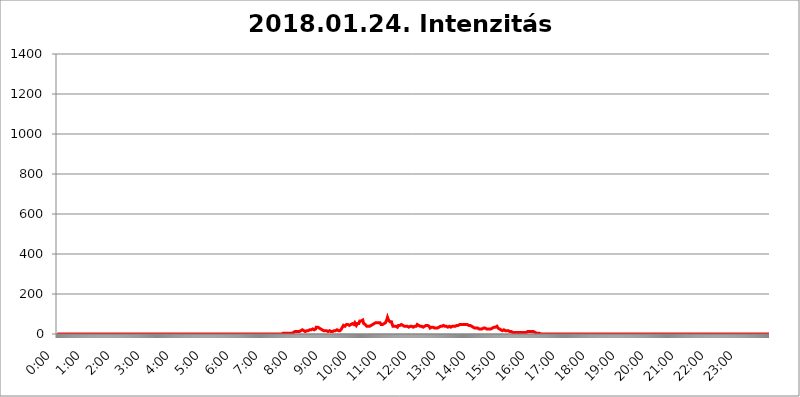
| Category | 2018.01.24. Intenzitás [W/m^2] |
|---|---|
| 0.0 | 0 |
| 0.0006944444444444445 | 0 |
| 0.001388888888888889 | 0 |
| 0.0020833333333333333 | 0 |
| 0.002777777777777778 | 0 |
| 0.003472222222222222 | 0 |
| 0.004166666666666667 | 0 |
| 0.004861111111111111 | 0 |
| 0.005555555555555556 | 0 |
| 0.0062499999999999995 | 0 |
| 0.006944444444444444 | 0 |
| 0.007638888888888889 | 0 |
| 0.008333333333333333 | 0 |
| 0.009027777777777779 | 0 |
| 0.009722222222222222 | 0 |
| 0.010416666666666666 | 0 |
| 0.011111111111111112 | 0 |
| 0.011805555555555555 | 0 |
| 0.012499999999999999 | 0 |
| 0.013194444444444444 | 0 |
| 0.013888888888888888 | 0 |
| 0.014583333333333332 | 0 |
| 0.015277777777777777 | 0 |
| 0.015972222222222224 | 0 |
| 0.016666666666666666 | 0 |
| 0.017361111111111112 | 0 |
| 0.018055555555555557 | 0 |
| 0.01875 | 0 |
| 0.019444444444444445 | 0 |
| 0.02013888888888889 | 0 |
| 0.020833333333333332 | 0 |
| 0.02152777777777778 | 0 |
| 0.022222222222222223 | 0 |
| 0.02291666666666667 | 0 |
| 0.02361111111111111 | 0 |
| 0.024305555555555556 | 0 |
| 0.024999999999999998 | 0 |
| 0.025694444444444447 | 0 |
| 0.02638888888888889 | 0 |
| 0.027083333333333334 | 0 |
| 0.027777777777777776 | 0 |
| 0.02847222222222222 | 0 |
| 0.029166666666666664 | 0 |
| 0.029861111111111113 | 0 |
| 0.030555555555555555 | 0 |
| 0.03125 | 0 |
| 0.03194444444444445 | 0 |
| 0.03263888888888889 | 0 |
| 0.03333333333333333 | 0 |
| 0.034027777777777775 | 0 |
| 0.034722222222222224 | 0 |
| 0.035416666666666666 | 0 |
| 0.036111111111111115 | 0 |
| 0.03680555555555556 | 0 |
| 0.0375 | 0 |
| 0.03819444444444444 | 0 |
| 0.03888888888888889 | 0 |
| 0.03958333333333333 | 0 |
| 0.04027777777777778 | 0 |
| 0.04097222222222222 | 0 |
| 0.041666666666666664 | 0 |
| 0.042361111111111106 | 0 |
| 0.04305555555555556 | 0 |
| 0.043750000000000004 | 0 |
| 0.044444444444444446 | 0 |
| 0.04513888888888889 | 0 |
| 0.04583333333333334 | 0 |
| 0.04652777777777778 | 0 |
| 0.04722222222222222 | 0 |
| 0.04791666666666666 | 0 |
| 0.04861111111111111 | 0 |
| 0.049305555555555554 | 0 |
| 0.049999999999999996 | 0 |
| 0.05069444444444445 | 0 |
| 0.051388888888888894 | 0 |
| 0.052083333333333336 | 0 |
| 0.05277777777777778 | 0 |
| 0.05347222222222222 | 0 |
| 0.05416666666666667 | 0 |
| 0.05486111111111111 | 0 |
| 0.05555555555555555 | 0 |
| 0.05625 | 0 |
| 0.05694444444444444 | 0 |
| 0.057638888888888885 | 0 |
| 0.05833333333333333 | 0 |
| 0.05902777777777778 | 0 |
| 0.059722222222222225 | 0 |
| 0.06041666666666667 | 0 |
| 0.061111111111111116 | 0 |
| 0.06180555555555556 | 0 |
| 0.0625 | 0 |
| 0.06319444444444444 | 0 |
| 0.06388888888888888 | 0 |
| 0.06458333333333334 | 0 |
| 0.06527777777777778 | 0 |
| 0.06597222222222222 | 0 |
| 0.06666666666666667 | 0 |
| 0.06736111111111111 | 0 |
| 0.06805555555555555 | 0 |
| 0.06874999999999999 | 0 |
| 0.06944444444444443 | 0 |
| 0.07013888888888889 | 0 |
| 0.07083333333333333 | 0 |
| 0.07152777777777779 | 0 |
| 0.07222222222222223 | 0 |
| 0.07291666666666667 | 0 |
| 0.07361111111111111 | 0 |
| 0.07430555555555556 | 0 |
| 0.075 | 0 |
| 0.07569444444444444 | 0 |
| 0.0763888888888889 | 0 |
| 0.07708333333333334 | 0 |
| 0.07777777777777778 | 0 |
| 0.07847222222222222 | 0 |
| 0.07916666666666666 | 0 |
| 0.0798611111111111 | 0 |
| 0.08055555555555556 | 0 |
| 0.08125 | 0 |
| 0.08194444444444444 | 0 |
| 0.08263888888888889 | 0 |
| 0.08333333333333333 | 0 |
| 0.08402777777777777 | 0 |
| 0.08472222222222221 | 0 |
| 0.08541666666666665 | 0 |
| 0.08611111111111112 | 0 |
| 0.08680555555555557 | 0 |
| 0.08750000000000001 | 0 |
| 0.08819444444444445 | 0 |
| 0.08888888888888889 | 0 |
| 0.08958333333333333 | 0 |
| 0.09027777777777778 | 0 |
| 0.09097222222222222 | 0 |
| 0.09166666666666667 | 0 |
| 0.09236111111111112 | 0 |
| 0.09305555555555556 | 0 |
| 0.09375 | 0 |
| 0.09444444444444444 | 0 |
| 0.09513888888888888 | 0 |
| 0.09583333333333333 | 0 |
| 0.09652777777777777 | 0 |
| 0.09722222222222222 | 0 |
| 0.09791666666666667 | 0 |
| 0.09861111111111111 | 0 |
| 0.09930555555555555 | 0 |
| 0.09999999999999999 | 0 |
| 0.10069444444444443 | 0 |
| 0.1013888888888889 | 0 |
| 0.10208333333333335 | 0 |
| 0.10277777777777779 | 0 |
| 0.10347222222222223 | 0 |
| 0.10416666666666667 | 0 |
| 0.10486111111111111 | 0 |
| 0.10555555555555556 | 0 |
| 0.10625 | 0 |
| 0.10694444444444444 | 0 |
| 0.1076388888888889 | 0 |
| 0.10833333333333334 | 0 |
| 0.10902777777777778 | 0 |
| 0.10972222222222222 | 0 |
| 0.1111111111111111 | 0 |
| 0.11180555555555556 | 0 |
| 0.11180555555555556 | 0 |
| 0.1125 | 0 |
| 0.11319444444444444 | 0 |
| 0.11388888888888889 | 0 |
| 0.11458333333333333 | 0 |
| 0.11527777777777777 | 0 |
| 0.11597222222222221 | 0 |
| 0.11666666666666665 | 0 |
| 0.1173611111111111 | 0 |
| 0.11805555555555557 | 0 |
| 0.11944444444444445 | 0 |
| 0.12013888888888889 | 0 |
| 0.12083333333333333 | 0 |
| 0.12152777777777778 | 0 |
| 0.12222222222222223 | 0 |
| 0.12291666666666667 | 0 |
| 0.12291666666666667 | 0 |
| 0.12361111111111112 | 0 |
| 0.12430555555555556 | 0 |
| 0.125 | 0 |
| 0.12569444444444444 | 0 |
| 0.12638888888888888 | 0 |
| 0.12708333333333333 | 0 |
| 0.16875 | 0 |
| 0.12847222222222224 | 0 |
| 0.12916666666666668 | 0 |
| 0.12986111111111112 | 0 |
| 0.13055555555555556 | 0 |
| 0.13125 | 0 |
| 0.13194444444444445 | 0 |
| 0.1326388888888889 | 0 |
| 0.13333333333333333 | 0 |
| 0.13402777777777777 | 0 |
| 0.13402777777777777 | 0 |
| 0.13472222222222222 | 0 |
| 0.13541666666666666 | 0 |
| 0.1361111111111111 | 0 |
| 0.13749999999999998 | 0 |
| 0.13819444444444443 | 0 |
| 0.1388888888888889 | 0 |
| 0.13958333333333334 | 0 |
| 0.14027777777777778 | 0 |
| 0.14097222222222222 | 0 |
| 0.14166666666666666 | 0 |
| 0.1423611111111111 | 0 |
| 0.14305555555555557 | 0 |
| 0.14375000000000002 | 0 |
| 0.14444444444444446 | 0 |
| 0.1451388888888889 | 0 |
| 0.1451388888888889 | 0 |
| 0.14652777777777778 | 0 |
| 0.14722222222222223 | 0 |
| 0.14791666666666667 | 0 |
| 0.1486111111111111 | 0 |
| 0.14930555555555555 | 0 |
| 0.15 | 0 |
| 0.15069444444444444 | 0 |
| 0.15138888888888888 | 0 |
| 0.15208333333333332 | 0 |
| 0.15277777777777776 | 0 |
| 0.15347222222222223 | 0 |
| 0.15416666666666667 | 0 |
| 0.15486111111111112 | 0 |
| 0.15555555555555556 | 0 |
| 0.15625 | 0 |
| 0.15694444444444444 | 0 |
| 0.15763888888888888 | 0 |
| 0.15833333333333333 | 0 |
| 0.15902777777777777 | 0 |
| 0.15972222222222224 | 0 |
| 0.16041666666666668 | 0 |
| 0.16111111111111112 | 0 |
| 0.16180555555555556 | 0 |
| 0.1625 | 0 |
| 0.16319444444444445 | 0 |
| 0.1638888888888889 | 0 |
| 0.16458333333333333 | 0 |
| 0.16527777777777777 | 0 |
| 0.16597222222222222 | 0 |
| 0.16666666666666666 | 0 |
| 0.1673611111111111 | 0 |
| 0.16805555555555554 | 0 |
| 0.16874999999999998 | 0 |
| 0.16944444444444443 | 0 |
| 0.17013888888888887 | 0 |
| 0.1708333333333333 | 0 |
| 0.17152777777777775 | 0 |
| 0.17222222222222225 | 0 |
| 0.1729166666666667 | 0 |
| 0.17361111111111113 | 0 |
| 0.17430555555555557 | 0 |
| 0.17500000000000002 | 0 |
| 0.17569444444444446 | 0 |
| 0.1763888888888889 | 0 |
| 0.17708333333333334 | 0 |
| 0.17777777777777778 | 0 |
| 0.17847222222222223 | 0 |
| 0.17916666666666667 | 0 |
| 0.1798611111111111 | 0 |
| 0.18055555555555555 | 0 |
| 0.18125 | 0 |
| 0.18194444444444444 | 0 |
| 0.1826388888888889 | 0 |
| 0.18333333333333335 | 0 |
| 0.1840277777777778 | 0 |
| 0.18472222222222223 | 0 |
| 0.18541666666666667 | 0 |
| 0.18611111111111112 | 0 |
| 0.18680555555555556 | 0 |
| 0.1875 | 0 |
| 0.18819444444444444 | 0 |
| 0.18888888888888888 | 0 |
| 0.18958333333333333 | 0 |
| 0.19027777777777777 | 0 |
| 0.1909722222222222 | 0 |
| 0.19166666666666665 | 0 |
| 0.19236111111111112 | 0 |
| 0.19305555555555554 | 0 |
| 0.19375 | 0 |
| 0.19444444444444445 | 0 |
| 0.1951388888888889 | 0 |
| 0.19583333333333333 | 0 |
| 0.19652777777777777 | 0 |
| 0.19722222222222222 | 0 |
| 0.19791666666666666 | 0 |
| 0.1986111111111111 | 0 |
| 0.19930555555555554 | 0 |
| 0.19999999999999998 | 0 |
| 0.20069444444444443 | 0 |
| 0.20138888888888887 | 0 |
| 0.2020833333333333 | 0 |
| 0.2027777777777778 | 0 |
| 0.2034722222222222 | 0 |
| 0.2041666666666667 | 0 |
| 0.20486111111111113 | 0 |
| 0.20555555555555557 | 0 |
| 0.20625000000000002 | 0 |
| 0.20694444444444446 | 0 |
| 0.2076388888888889 | 0 |
| 0.20833333333333334 | 0 |
| 0.20902777777777778 | 0 |
| 0.20972222222222223 | 0 |
| 0.21041666666666667 | 0 |
| 0.2111111111111111 | 0 |
| 0.21180555555555555 | 0 |
| 0.2125 | 0 |
| 0.21319444444444444 | 0 |
| 0.2138888888888889 | 0 |
| 0.21458333333333335 | 0 |
| 0.2152777777777778 | 0 |
| 0.21597222222222223 | 0 |
| 0.21666666666666667 | 0 |
| 0.21736111111111112 | 0 |
| 0.21805555555555556 | 0 |
| 0.21875 | 0 |
| 0.21944444444444444 | 0 |
| 0.22013888888888888 | 0 |
| 0.22083333333333333 | 0 |
| 0.22152777777777777 | 0 |
| 0.2222222222222222 | 0 |
| 0.22291666666666665 | 0 |
| 0.2236111111111111 | 0 |
| 0.22430555555555556 | 0 |
| 0.225 | 0 |
| 0.22569444444444445 | 0 |
| 0.2263888888888889 | 0 |
| 0.22708333333333333 | 0 |
| 0.22777777777777777 | 0 |
| 0.22847222222222222 | 0 |
| 0.22916666666666666 | 0 |
| 0.2298611111111111 | 0 |
| 0.23055555555555554 | 0 |
| 0.23124999999999998 | 0 |
| 0.23194444444444443 | 0 |
| 0.23263888888888887 | 0 |
| 0.2333333333333333 | 0 |
| 0.2340277777777778 | 0 |
| 0.2347222222222222 | 0 |
| 0.2354166666666667 | 0 |
| 0.23611111111111113 | 0 |
| 0.23680555555555557 | 0 |
| 0.23750000000000002 | 0 |
| 0.23819444444444446 | 0 |
| 0.2388888888888889 | 0 |
| 0.23958333333333334 | 0 |
| 0.24027777777777778 | 0 |
| 0.24097222222222223 | 0 |
| 0.24166666666666667 | 0 |
| 0.2423611111111111 | 0 |
| 0.24305555555555555 | 0 |
| 0.24375 | 0 |
| 0.24444444444444446 | 0 |
| 0.24513888888888888 | 0 |
| 0.24583333333333335 | 0 |
| 0.2465277777777778 | 0 |
| 0.24722222222222223 | 0 |
| 0.24791666666666667 | 0 |
| 0.24861111111111112 | 0 |
| 0.24930555555555556 | 0 |
| 0.25 | 0 |
| 0.25069444444444444 | 0 |
| 0.2513888888888889 | 0 |
| 0.2520833333333333 | 0 |
| 0.25277777777777777 | 0 |
| 0.2534722222222222 | 0 |
| 0.25416666666666665 | 0 |
| 0.2548611111111111 | 0 |
| 0.2555555555555556 | 0 |
| 0.25625000000000003 | 0 |
| 0.2569444444444445 | 0 |
| 0.2576388888888889 | 0 |
| 0.25833333333333336 | 0 |
| 0.2590277777777778 | 0 |
| 0.25972222222222224 | 0 |
| 0.2604166666666667 | 0 |
| 0.2611111111111111 | 0 |
| 0.26180555555555557 | 0 |
| 0.2625 | 0 |
| 0.26319444444444445 | 0 |
| 0.2638888888888889 | 0 |
| 0.26458333333333334 | 0 |
| 0.2652777777777778 | 0 |
| 0.2659722222222222 | 0 |
| 0.26666666666666666 | 0 |
| 0.2673611111111111 | 0 |
| 0.26805555555555555 | 0 |
| 0.26875 | 0 |
| 0.26944444444444443 | 0 |
| 0.2701388888888889 | 0 |
| 0.2708333333333333 | 0 |
| 0.27152777777777776 | 0 |
| 0.2722222222222222 | 0 |
| 0.27291666666666664 | 0 |
| 0.2736111111111111 | 0 |
| 0.2743055555555555 | 0 |
| 0.27499999999999997 | 0 |
| 0.27569444444444446 | 0 |
| 0.27638888888888885 | 0 |
| 0.27708333333333335 | 0 |
| 0.2777777777777778 | 0 |
| 0.27847222222222223 | 0 |
| 0.2791666666666667 | 0 |
| 0.2798611111111111 | 0 |
| 0.28055555555555556 | 0 |
| 0.28125 | 0 |
| 0.28194444444444444 | 0 |
| 0.2826388888888889 | 0 |
| 0.2833333333333333 | 0 |
| 0.28402777777777777 | 0 |
| 0.2847222222222222 | 0 |
| 0.28541666666666665 | 0 |
| 0.28611111111111115 | 0 |
| 0.28680555555555554 | 0 |
| 0.28750000000000003 | 0 |
| 0.2881944444444445 | 0 |
| 0.2888888888888889 | 0 |
| 0.28958333333333336 | 0 |
| 0.2902777777777778 | 0 |
| 0.29097222222222224 | 0 |
| 0.2916666666666667 | 0 |
| 0.2923611111111111 | 0 |
| 0.29305555555555557 | 0 |
| 0.29375 | 0 |
| 0.29444444444444445 | 0 |
| 0.2951388888888889 | 0 |
| 0.29583333333333334 | 0 |
| 0.2965277777777778 | 0 |
| 0.2972222222222222 | 0 |
| 0.29791666666666666 | 0 |
| 0.2986111111111111 | 0 |
| 0.29930555555555555 | 0 |
| 0.3 | 0 |
| 0.30069444444444443 | 0 |
| 0.3013888888888889 | 0 |
| 0.3020833333333333 | 0 |
| 0.30277777777777776 | 0 |
| 0.3034722222222222 | 0 |
| 0.30416666666666664 | 0 |
| 0.3048611111111111 | 0 |
| 0.3055555555555555 | 0 |
| 0.30624999999999997 | 0 |
| 0.3069444444444444 | 0 |
| 0.3076388888888889 | 0 |
| 0.30833333333333335 | 0 |
| 0.3090277777777778 | 0 |
| 0.30972222222222223 | 0 |
| 0.3104166666666667 | 0 |
| 0.3111111111111111 | 0 |
| 0.31180555555555556 | 0 |
| 0.3125 | 0 |
| 0.31319444444444444 | 0 |
| 0.3138888888888889 | 0 |
| 0.3145833333333333 | 0 |
| 0.31527777777777777 | 0 |
| 0.3159722222222222 | 3.525 |
| 0.31666666666666665 | 3.525 |
| 0.31736111111111115 | 3.525 |
| 0.31805555555555554 | 3.525 |
| 0.31875000000000003 | 3.525 |
| 0.3194444444444445 | 3.525 |
| 0.3201388888888889 | 3.525 |
| 0.32083333333333336 | 3.525 |
| 0.3215277777777778 | 3.525 |
| 0.32222222222222224 | 3.525 |
| 0.3229166666666667 | 3.525 |
| 0.3236111111111111 | 3.525 |
| 0.32430555555555557 | 3.525 |
| 0.325 | 3.525 |
| 0.32569444444444445 | 3.525 |
| 0.3263888888888889 | 7.887 |
| 0.32708333333333334 | 3.525 |
| 0.3277777777777778 | 3.525 |
| 0.3284722222222222 | 3.525 |
| 0.32916666666666666 | 3.525 |
| 0.3298611111111111 | 3.525 |
| 0.33055555555555555 | 3.525 |
| 0.33125 | 7.887 |
| 0.33194444444444443 | 7.887 |
| 0.3326388888888889 | 12.257 |
| 0.3333333333333333 | 12.257 |
| 0.3340277777777778 | 12.257 |
| 0.3347222222222222 | 12.257 |
| 0.3354166666666667 | 12.257 |
| 0.3361111111111111 | 12.257 |
| 0.3368055555555556 | 12.257 |
| 0.33749999999999997 | 12.257 |
| 0.33819444444444446 | 12.257 |
| 0.33888888888888885 | 12.257 |
| 0.33958333333333335 | 12.257 |
| 0.34027777777777773 | 12.257 |
| 0.34097222222222223 | 16.636 |
| 0.3416666666666666 | 16.636 |
| 0.3423611111111111 | 21.024 |
| 0.3430555555555555 | 21.024 |
| 0.34375 | 21.024 |
| 0.3444444444444445 | 21.024 |
| 0.3451388888888889 | 21.024 |
| 0.3458333333333334 | 16.636 |
| 0.34652777777777777 | 16.636 |
| 0.34722222222222227 | 12.257 |
| 0.34791666666666665 | 12.257 |
| 0.34861111111111115 | 12.257 |
| 0.34930555555555554 | 12.257 |
| 0.35000000000000003 | 16.636 |
| 0.3506944444444444 | 16.636 |
| 0.3513888888888889 | 16.636 |
| 0.3520833333333333 | 16.636 |
| 0.3527777777777778 | 21.024 |
| 0.3534722222222222 | 21.024 |
| 0.3541666666666667 | 21.024 |
| 0.3548611111111111 | 21.024 |
| 0.35555555555555557 | 21.024 |
| 0.35625 | 21.024 |
| 0.35694444444444445 | 25.419 |
| 0.3576388888888889 | 25.419 |
| 0.35833333333333334 | 25.419 |
| 0.3590277777777778 | 25.419 |
| 0.3597222222222222 | 21.024 |
| 0.36041666666666666 | 21.024 |
| 0.3611111111111111 | 21.024 |
| 0.36180555555555555 | 21.024 |
| 0.3625 | 25.419 |
| 0.36319444444444443 | 34.234 |
| 0.3638888888888889 | 34.234 |
| 0.3645833333333333 | 34.234 |
| 0.3652777777777778 | 34.234 |
| 0.3659722222222222 | 34.234 |
| 0.3666666666666667 | 29.823 |
| 0.3673611111111111 | 29.823 |
| 0.3680555555555556 | 29.823 |
| 0.36874999999999997 | 29.823 |
| 0.36944444444444446 | 25.419 |
| 0.37013888888888885 | 25.419 |
| 0.37083333333333335 | 21.024 |
| 0.37152777777777773 | 21.024 |
| 0.37222222222222223 | 21.024 |
| 0.3729166666666666 | 21.024 |
| 0.3736111111111111 | 16.636 |
| 0.3743055555555555 | 16.636 |
| 0.375 | 16.636 |
| 0.3756944444444445 | 16.636 |
| 0.3763888888888889 | 16.636 |
| 0.3770833333333334 | 16.636 |
| 0.37777777777777777 | 16.636 |
| 0.37847222222222227 | 16.636 |
| 0.37916666666666665 | 12.257 |
| 0.37986111111111115 | 12.257 |
| 0.38055555555555554 | 12.257 |
| 0.38125000000000003 | 16.636 |
| 0.3819444444444444 | 16.636 |
| 0.3826388888888889 | 16.636 |
| 0.3833333333333333 | 16.636 |
| 0.3840277777777778 | 12.257 |
| 0.3847222222222222 | 12.257 |
| 0.3854166666666667 | 12.257 |
| 0.3861111111111111 | 12.257 |
| 0.38680555555555557 | 16.636 |
| 0.3875 | 16.636 |
| 0.38819444444444445 | 16.636 |
| 0.3888888888888889 | 16.636 |
| 0.38958333333333334 | 16.636 |
| 0.3902777777777778 | 16.636 |
| 0.3909722222222222 | 21.024 |
| 0.39166666666666666 | 21.024 |
| 0.3923611111111111 | 21.024 |
| 0.39305555555555555 | 21.024 |
| 0.39375 | 21.024 |
| 0.39444444444444443 | 16.636 |
| 0.3951388888888889 | 16.636 |
| 0.3958333333333333 | 16.636 |
| 0.3965277777777778 | 16.636 |
| 0.3972222222222222 | 21.024 |
| 0.3979166666666667 | 21.024 |
| 0.3986111111111111 | 25.419 |
| 0.3993055555555556 | 29.823 |
| 0.39999999999999997 | 34.234 |
| 0.40069444444444446 | 38.653 |
| 0.40138888888888885 | 43.079 |
| 0.40208333333333335 | 38.653 |
| 0.40277777777777773 | 38.653 |
| 0.40347222222222223 | 38.653 |
| 0.4041666666666666 | 38.653 |
| 0.4048611111111111 | 43.079 |
| 0.4055555555555555 | 47.511 |
| 0.40625 | 47.511 |
| 0.4069444444444445 | 47.511 |
| 0.4076388888888889 | 47.511 |
| 0.4083333333333334 | 47.511 |
| 0.40902777777777777 | 43.079 |
| 0.40972222222222227 | 43.079 |
| 0.41041666666666665 | 43.079 |
| 0.41111111111111115 | 47.511 |
| 0.41180555555555554 | 47.511 |
| 0.41250000000000003 | 47.511 |
| 0.4131944444444444 | 51.951 |
| 0.4138888888888889 | 51.951 |
| 0.4145833333333333 | 51.951 |
| 0.4152777777777778 | 47.511 |
| 0.4159722222222222 | 47.511 |
| 0.4166666666666667 | 51.951 |
| 0.4173611111111111 | 56.398 |
| 0.41805555555555557 | 56.398 |
| 0.41875 | 51.951 |
| 0.41944444444444445 | 43.079 |
| 0.4201388888888889 | 47.511 |
| 0.42083333333333334 | 51.951 |
| 0.4215277777777778 | 51.951 |
| 0.4222222222222222 | 51.951 |
| 0.42291666666666666 | 51.951 |
| 0.4236111111111111 | 56.398 |
| 0.42430555555555555 | 65.31 |
| 0.425 | 69.775 |
| 0.42569444444444443 | 69.775 |
| 0.4263888888888889 | 65.31 |
| 0.4270833333333333 | 65.31 |
| 0.4277777777777778 | 65.31 |
| 0.4284722222222222 | 69.775 |
| 0.4291666666666667 | 60.85 |
| 0.4298611111111111 | 51.951 |
| 0.4305555555555556 | 47.511 |
| 0.43124999999999997 | 47.511 |
| 0.43194444444444446 | 47.511 |
| 0.43263888888888885 | 43.079 |
| 0.43333333333333335 | 43.079 |
| 0.43402777777777773 | 38.653 |
| 0.43472222222222223 | 38.653 |
| 0.4354166666666666 | 38.653 |
| 0.4361111111111111 | 38.653 |
| 0.4368055555555555 | 38.653 |
| 0.4375 | 38.653 |
| 0.4381944444444445 | 38.653 |
| 0.4388888888888889 | 38.653 |
| 0.4395833333333334 | 38.653 |
| 0.44027777777777777 | 43.079 |
| 0.44097222222222227 | 47.511 |
| 0.44166666666666665 | 47.511 |
| 0.44236111111111115 | 47.511 |
| 0.44305555555555554 | 47.511 |
| 0.44375000000000003 | 51.951 |
| 0.4444444444444444 | 51.951 |
| 0.4451388888888889 | 51.951 |
| 0.4458333333333333 | 56.398 |
| 0.4465277777777778 | 56.398 |
| 0.4472222222222222 | 56.398 |
| 0.4479166666666667 | 56.398 |
| 0.4486111111111111 | 56.398 |
| 0.44930555555555557 | 56.398 |
| 0.45 | 60.85 |
| 0.45069444444444445 | 56.398 |
| 0.4513888888888889 | 56.398 |
| 0.45208333333333334 | 56.398 |
| 0.4527777777777778 | 56.398 |
| 0.4534722222222222 | 51.951 |
| 0.45416666666666666 | 47.511 |
| 0.4548611111111111 | 47.511 |
| 0.45555555555555555 | 47.511 |
| 0.45625 | 47.511 |
| 0.45694444444444443 | 51.951 |
| 0.4576388888888889 | 47.511 |
| 0.4583333333333333 | 51.951 |
| 0.4590277777777778 | 51.951 |
| 0.4597222222222222 | 56.398 |
| 0.4604166666666667 | 56.398 |
| 0.4611111111111111 | 56.398 |
| 0.4618055555555556 | 60.85 |
| 0.46249999999999997 | 74.246 |
| 0.46319444444444446 | 83.205 |
| 0.46388888888888885 | 78.722 |
| 0.46458333333333335 | 69.775 |
| 0.46527777777777773 | 65.31 |
| 0.46597222222222223 | 65.31 |
| 0.4666666666666666 | 60.85 |
| 0.4673611111111111 | 56.398 |
| 0.4680555555555555 | 65.31 |
| 0.46875 | 60.85 |
| 0.4694444444444445 | 51.951 |
| 0.4701388888888889 | 47.511 |
| 0.4708333333333334 | 38.653 |
| 0.47152777777777777 | 38.653 |
| 0.47222222222222227 | 38.653 |
| 0.47291666666666665 | 38.653 |
| 0.47361111111111115 | 38.653 |
| 0.47430555555555554 | 38.653 |
| 0.47500000000000003 | 38.653 |
| 0.4756944444444444 | 38.653 |
| 0.4763888888888889 | 34.234 |
| 0.4770833333333333 | 34.234 |
| 0.4777777777777778 | 38.653 |
| 0.4784722222222222 | 43.079 |
| 0.4791666666666667 | 47.511 |
| 0.4798611111111111 | 43.079 |
| 0.48055555555555557 | 43.079 |
| 0.48125 | 47.511 |
| 0.48194444444444445 | 47.511 |
| 0.4826388888888889 | 47.511 |
| 0.48333333333333334 | 47.511 |
| 0.4840277777777778 | 47.511 |
| 0.4847222222222222 | 43.079 |
| 0.48541666666666666 | 38.653 |
| 0.4861111111111111 | 43.079 |
| 0.48680555555555555 | 38.653 |
| 0.4875 | 38.653 |
| 0.48819444444444443 | 38.653 |
| 0.4888888888888889 | 38.653 |
| 0.4895833333333333 | 38.653 |
| 0.4902777777777778 | 38.653 |
| 0.4909722222222222 | 38.653 |
| 0.4916666666666667 | 38.653 |
| 0.4923611111111111 | 34.234 |
| 0.4930555555555556 | 34.234 |
| 0.49374999999999997 | 38.653 |
| 0.49444444444444446 | 34.234 |
| 0.49513888888888885 | 38.653 |
| 0.49583333333333335 | 38.653 |
| 0.49652777777777773 | 38.653 |
| 0.49722222222222223 | 38.653 |
| 0.4979166666666666 | 34.234 |
| 0.4986111111111111 | 34.234 |
| 0.4993055555555555 | 34.234 |
| 0.5 | 38.653 |
| 0.5006944444444444 | 38.653 |
| 0.5013888888888889 | 38.653 |
| 0.5020833333333333 | 38.653 |
| 0.5027777777777778 | 38.653 |
| 0.5034722222222222 | 38.653 |
| 0.5041666666666667 | 43.079 |
| 0.5048611111111111 | 47.511 |
| 0.5055555555555555 | 47.511 |
| 0.50625 | 47.511 |
| 0.5069444444444444 | 43.079 |
| 0.5076388888888889 | 38.653 |
| 0.5083333333333333 | 38.653 |
| 0.5090277777777777 | 38.653 |
| 0.5097222222222222 | 38.653 |
| 0.5104166666666666 | 38.653 |
| 0.5111111111111112 | 38.653 |
| 0.5118055555555555 | 38.653 |
| 0.5125000000000001 | 38.653 |
| 0.5131944444444444 | 34.234 |
| 0.513888888888889 | 38.653 |
| 0.5145833333333333 | 38.653 |
| 0.5152777777777778 | 38.653 |
| 0.5159722222222222 | 38.653 |
| 0.5166666666666667 | 38.653 |
| 0.517361111111111 | 43.079 |
| 0.5180555555555556 | 38.653 |
| 0.5187499999999999 | 43.079 |
| 0.5194444444444445 | 43.079 |
| 0.5201388888888888 | 47.511 |
| 0.5208333333333334 | 43.079 |
| 0.5215277777777778 | 38.653 |
| 0.5222222222222223 | 34.234 |
| 0.5229166666666667 | 29.823 |
| 0.5236111111111111 | 29.823 |
| 0.5243055555555556 | 29.823 |
| 0.525 | 34.234 |
| 0.5256944444444445 | 34.234 |
| 0.5263888888888889 | 34.234 |
| 0.5270833333333333 | 34.234 |
| 0.5277777777777778 | 29.823 |
| 0.5284722222222222 | 34.234 |
| 0.5291666666666667 | 29.823 |
| 0.5298611111111111 | 29.823 |
| 0.5305555555555556 | 29.823 |
| 0.53125 | 29.823 |
| 0.5319444444444444 | 29.823 |
| 0.5326388888888889 | 29.823 |
| 0.5333333333333333 | 29.823 |
| 0.5340277777777778 | 29.823 |
| 0.5347222222222222 | 29.823 |
| 0.5354166666666667 | 34.234 |
| 0.5361111111111111 | 34.234 |
| 0.5368055555555555 | 38.653 |
| 0.5375 | 38.653 |
| 0.5381944444444444 | 38.653 |
| 0.5388888888888889 | 38.653 |
| 0.5395833333333333 | 38.653 |
| 0.5402777777777777 | 34.234 |
| 0.5409722222222222 | 38.653 |
| 0.5416666666666666 | 43.079 |
| 0.5423611111111112 | 43.079 |
| 0.5430555555555555 | 38.653 |
| 0.5437500000000001 | 38.653 |
| 0.5444444444444444 | 38.653 |
| 0.545138888888889 | 38.653 |
| 0.5458333333333333 | 38.653 |
| 0.5465277777777778 | 38.653 |
| 0.5472222222222222 | 34.234 |
| 0.5479166666666667 | 34.234 |
| 0.548611111111111 | 38.653 |
| 0.5493055555555556 | 34.234 |
| 0.5499999999999999 | 38.653 |
| 0.5506944444444445 | 38.653 |
| 0.5513888888888888 | 34.234 |
| 0.5520833333333334 | 34.234 |
| 0.5527777777777778 | 34.234 |
| 0.5534722222222223 | 34.234 |
| 0.5541666666666667 | 38.653 |
| 0.5548611111111111 | 34.234 |
| 0.5555555555555556 | 34.234 |
| 0.55625 | 38.653 |
| 0.5569444444444445 | 38.653 |
| 0.5576388888888889 | 38.653 |
| 0.5583333333333333 | 38.653 |
| 0.5590277777777778 | 43.079 |
| 0.5597222222222222 | 43.079 |
| 0.5604166666666667 | 43.079 |
| 0.5611111111111111 | 43.079 |
| 0.5618055555555556 | 43.079 |
| 0.5625 | 43.079 |
| 0.5631944444444444 | 43.079 |
| 0.5638888888888889 | 43.079 |
| 0.5645833333333333 | 47.511 |
| 0.5652777777777778 | 43.079 |
| 0.5659722222222222 | 47.511 |
| 0.5666666666666667 | 47.511 |
| 0.5673611111111111 | 43.079 |
| 0.5680555555555555 | 47.511 |
| 0.56875 | 47.511 |
| 0.5694444444444444 | 47.511 |
| 0.5701388888888889 | 47.511 |
| 0.5708333333333333 | 47.511 |
| 0.5715277777777777 | 47.511 |
| 0.5722222222222222 | 47.511 |
| 0.5729166666666666 | 47.511 |
| 0.5736111111111112 | 47.511 |
| 0.5743055555555555 | 47.511 |
| 0.5750000000000001 | 47.511 |
| 0.5756944444444444 | 47.511 |
| 0.576388888888889 | 43.079 |
| 0.5770833333333333 | 43.079 |
| 0.5777777777777778 | 43.079 |
| 0.5784722222222222 | 43.079 |
| 0.5791666666666667 | 43.079 |
| 0.579861111111111 | 38.653 |
| 0.5805555555555556 | 38.653 |
| 0.5812499999999999 | 38.653 |
| 0.5819444444444445 | 38.653 |
| 0.5826388888888888 | 38.653 |
| 0.5833333333333334 | 34.234 |
| 0.5840277777777778 | 34.234 |
| 0.5847222222222223 | 29.823 |
| 0.5854166666666667 | 29.823 |
| 0.5861111111111111 | 29.823 |
| 0.5868055555555556 | 29.823 |
| 0.5875 | 29.823 |
| 0.5881944444444445 | 29.823 |
| 0.5888888888888889 | 29.823 |
| 0.5895833333333333 | 29.823 |
| 0.5902777777777778 | 29.823 |
| 0.5909722222222222 | 29.823 |
| 0.5916666666666667 | 25.419 |
| 0.5923611111111111 | 25.419 |
| 0.5930555555555556 | 25.419 |
| 0.59375 | 25.419 |
| 0.5944444444444444 | 25.419 |
| 0.5951388888888889 | 25.419 |
| 0.5958333333333333 | 25.419 |
| 0.5965277777777778 | 29.823 |
| 0.5972222222222222 | 29.823 |
| 0.5979166666666667 | 29.823 |
| 0.5986111111111111 | 29.823 |
| 0.5993055555555555 | 29.823 |
| 0.6 | 29.823 |
| 0.6006944444444444 | 29.823 |
| 0.6013888888888889 | 25.419 |
| 0.6020833333333333 | 25.419 |
| 0.6027777777777777 | 25.419 |
| 0.6034722222222222 | 25.419 |
| 0.6041666666666666 | 25.419 |
| 0.6048611111111112 | 25.419 |
| 0.6055555555555555 | 25.419 |
| 0.6062500000000001 | 25.419 |
| 0.6069444444444444 | 21.024 |
| 0.607638888888889 | 21.024 |
| 0.6083333333333333 | 25.419 |
| 0.6090277777777778 | 25.419 |
| 0.6097222222222222 | 25.419 |
| 0.6104166666666667 | 29.823 |
| 0.611111111111111 | 29.823 |
| 0.6118055555555556 | 29.823 |
| 0.6124999999999999 | 34.234 |
| 0.6131944444444445 | 34.234 |
| 0.6138888888888888 | 34.234 |
| 0.6145833333333334 | 34.234 |
| 0.6152777777777778 | 34.234 |
| 0.6159722222222223 | 38.653 |
| 0.6166666666666667 | 38.653 |
| 0.6173611111111111 | 38.653 |
| 0.6180555555555556 | 29.823 |
| 0.61875 | 29.823 |
| 0.6194444444444445 | 29.823 |
| 0.6201388888888889 | 25.419 |
| 0.6208333333333333 | 25.419 |
| 0.6215277777777778 | 25.419 |
| 0.6222222222222222 | 21.024 |
| 0.6229166666666667 | 21.024 |
| 0.6236111111111111 | 21.024 |
| 0.6243055555555556 | 16.636 |
| 0.625 | 16.636 |
| 0.6256944444444444 | 16.636 |
| 0.6263888888888889 | 21.024 |
| 0.6270833333333333 | 21.024 |
| 0.6277777777777778 | 21.024 |
| 0.6284722222222222 | 16.636 |
| 0.6291666666666667 | 21.024 |
| 0.6298611111111111 | 21.024 |
| 0.6305555555555555 | 16.636 |
| 0.63125 | 16.636 |
| 0.6319444444444444 | 16.636 |
| 0.6326388888888889 | 16.636 |
| 0.6333333333333333 | 12.257 |
| 0.6340277777777777 | 12.257 |
| 0.6347222222222222 | 12.257 |
| 0.6354166666666666 | 12.257 |
| 0.6361111111111112 | 12.257 |
| 0.6368055555555555 | 12.257 |
| 0.6375000000000001 | 12.257 |
| 0.6381944444444444 | 7.887 |
| 0.638888888888889 | 7.887 |
| 0.6395833333333333 | 7.887 |
| 0.6402777777777778 | 7.887 |
| 0.6409722222222222 | 7.887 |
| 0.6416666666666667 | 7.887 |
| 0.642361111111111 | 7.887 |
| 0.6430555555555556 | 7.887 |
| 0.6437499999999999 | 7.887 |
| 0.6444444444444445 | 7.887 |
| 0.6451388888888888 | 7.887 |
| 0.6458333333333334 | 7.887 |
| 0.6465277777777778 | 7.887 |
| 0.6472222222222223 | 7.887 |
| 0.6479166666666667 | 7.887 |
| 0.6486111111111111 | 12.257 |
| 0.6493055555555556 | 7.887 |
| 0.65 | 7.887 |
| 0.6506944444444445 | 7.887 |
| 0.6513888888888889 | 7.887 |
| 0.6520833333333333 | 7.887 |
| 0.6527777777777778 | 7.887 |
| 0.6534722222222222 | 7.887 |
| 0.6541666666666667 | 7.887 |
| 0.6548611111111111 | 7.887 |
| 0.6555555555555556 | 7.887 |
| 0.65625 | 7.887 |
| 0.6569444444444444 | 7.887 |
| 0.6576388888888889 | 7.887 |
| 0.6583333333333333 | 7.887 |
| 0.6590277777777778 | 12.257 |
| 0.6597222222222222 | 12.257 |
| 0.6604166666666667 | 12.257 |
| 0.6611111111111111 | 12.257 |
| 0.6618055555555555 | 12.257 |
| 0.6625 | 12.257 |
| 0.6631944444444444 | 12.257 |
| 0.6638888888888889 | 12.257 |
| 0.6645833333333333 | 12.257 |
| 0.6652777777777777 | 12.257 |
| 0.6659722222222222 | 12.257 |
| 0.6666666666666666 | 12.257 |
| 0.6673611111111111 | 12.257 |
| 0.6680555555555556 | 12.257 |
| 0.6687500000000001 | 12.257 |
| 0.6694444444444444 | 12.257 |
| 0.6701388888888888 | 7.887 |
| 0.6708333333333334 | 7.887 |
| 0.6715277777777778 | 7.887 |
| 0.6722222222222222 | 3.525 |
| 0.6729166666666666 | 3.525 |
| 0.6736111111111112 | 3.525 |
| 0.6743055555555556 | 3.525 |
| 0.6749999999999999 | 3.525 |
| 0.6756944444444444 | 3.525 |
| 0.6763888888888889 | 3.525 |
| 0.6770833333333334 | 0 |
| 0.6777777777777777 | 0 |
| 0.6784722222222223 | 0 |
| 0.6791666666666667 | 0 |
| 0.6798611111111111 | 0 |
| 0.6805555555555555 | 0 |
| 0.68125 | 0 |
| 0.6819444444444445 | 0 |
| 0.6826388888888889 | 0 |
| 0.6833333333333332 | 0 |
| 0.6840277777777778 | 0 |
| 0.6847222222222222 | 0 |
| 0.6854166666666667 | 0 |
| 0.686111111111111 | 0 |
| 0.6868055555555556 | 0 |
| 0.6875 | 0 |
| 0.6881944444444444 | 0 |
| 0.688888888888889 | 0 |
| 0.6895833333333333 | 0 |
| 0.6902777777777778 | 0 |
| 0.6909722222222222 | 0 |
| 0.6916666666666668 | 0 |
| 0.6923611111111111 | 0 |
| 0.6930555555555555 | 0 |
| 0.69375 | 0 |
| 0.6944444444444445 | 0 |
| 0.6951388888888889 | 0 |
| 0.6958333333333333 | 0 |
| 0.6965277777777777 | 0 |
| 0.6972222222222223 | 0 |
| 0.6979166666666666 | 0 |
| 0.6986111111111111 | 0 |
| 0.6993055555555556 | 0 |
| 0.7000000000000001 | 0 |
| 0.7006944444444444 | 0 |
| 0.7013888888888888 | 0 |
| 0.7020833333333334 | 0 |
| 0.7027777777777778 | 0 |
| 0.7034722222222222 | 0 |
| 0.7041666666666666 | 0 |
| 0.7048611111111112 | 0 |
| 0.7055555555555556 | 0 |
| 0.7062499999999999 | 0 |
| 0.7069444444444444 | 0 |
| 0.7076388888888889 | 0 |
| 0.7083333333333334 | 0 |
| 0.7090277777777777 | 0 |
| 0.7097222222222223 | 0 |
| 0.7104166666666667 | 0 |
| 0.7111111111111111 | 0 |
| 0.7118055555555555 | 0 |
| 0.7125 | 0 |
| 0.7131944444444445 | 0 |
| 0.7138888888888889 | 0 |
| 0.7145833333333332 | 0 |
| 0.7152777777777778 | 0 |
| 0.7159722222222222 | 0 |
| 0.7166666666666667 | 0 |
| 0.717361111111111 | 0 |
| 0.7180555555555556 | 0 |
| 0.71875 | 0 |
| 0.7194444444444444 | 0 |
| 0.720138888888889 | 0 |
| 0.7208333333333333 | 0 |
| 0.7215277777777778 | 0 |
| 0.7222222222222222 | 0 |
| 0.7229166666666668 | 0 |
| 0.7236111111111111 | 0 |
| 0.7243055555555555 | 0 |
| 0.725 | 0 |
| 0.7256944444444445 | 0 |
| 0.7263888888888889 | 0 |
| 0.7270833333333333 | 0 |
| 0.7277777777777777 | 0 |
| 0.7284722222222223 | 0 |
| 0.7291666666666666 | 0 |
| 0.7298611111111111 | 0 |
| 0.7305555555555556 | 0 |
| 0.7312500000000001 | 0 |
| 0.7319444444444444 | 0 |
| 0.7326388888888888 | 0 |
| 0.7333333333333334 | 0 |
| 0.7340277777777778 | 0 |
| 0.7347222222222222 | 0 |
| 0.7354166666666666 | 0 |
| 0.7361111111111112 | 0 |
| 0.7368055555555556 | 0 |
| 0.7374999999999999 | 0 |
| 0.7381944444444444 | 0 |
| 0.7388888888888889 | 0 |
| 0.7395833333333334 | 0 |
| 0.7402777777777777 | 0 |
| 0.7409722222222223 | 0 |
| 0.7416666666666667 | 0 |
| 0.7423611111111111 | 0 |
| 0.7430555555555555 | 0 |
| 0.74375 | 0 |
| 0.7444444444444445 | 0 |
| 0.7451388888888889 | 0 |
| 0.7458333333333332 | 0 |
| 0.7465277777777778 | 0 |
| 0.7472222222222222 | 0 |
| 0.7479166666666667 | 0 |
| 0.748611111111111 | 0 |
| 0.7493055555555556 | 0 |
| 0.75 | 0 |
| 0.7506944444444444 | 0 |
| 0.751388888888889 | 0 |
| 0.7520833333333333 | 0 |
| 0.7527777777777778 | 0 |
| 0.7534722222222222 | 0 |
| 0.7541666666666668 | 0 |
| 0.7548611111111111 | 0 |
| 0.7555555555555555 | 0 |
| 0.75625 | 0 |
| 0.7569444444444445 | 0 |
| 0.7576388888888889 | 0 |
| 0.7583333333333333 | 0 |
| 0.7590277777777777 | 0 |
| 0.7597222222222223 | 0 |
| 0.7604166666666666 | 0 |
| 0.7611111111111111 | 0 |
| 0.7618055555555556 | 0 |
| 0.7625000000000001 | 0 |
| 0.7631944444444444 | 0 |
| 0.7638888888888888 | 0 |
| 0.7645833333333334 | 0 |
| 0.7652777777777778 | 0 |
| 0.7659722222222222 | 0 |
| 0.7666666666666666 | 0 |
| 0.7673611111111112 | 0 |
| 0.7680555555555556 | 0 |
| 0.7687499999999999 | 0 |
| 0.7694444444444444 | 0 |
| 0.7701388888888889 | 0 |
| 0.7708333333333334 | 0 |
| 0.7715277777777777 | 0 |
| 0.7722222222222223 | 0 |
| 0.7729166666666667 | 0 |
| 0.7736111111111111 | 0 |
| 0.7743055555555555 | 0 |
| 0.775 | 0 |
| 0.7756944444444445 | 0 |
| 0.7763888888888889 | 0 |
| 0.7770833333333332 | 0 |
| 0.7777777777777778 | 0 |
| 0.7784722222222222 | 0 |
| 0.7791666666666667 | 0 |
| 0.779861111111111 | 0 |
| 0.7805555555555556 | 0 |
| 0.78125 | 0 |
| 0.7819444444444444 | 0 |
| 0.782638888888889 | 0 |
| 0.7833333333333333 | 0 |
| 0.7840277777777778 | 0 |
| 0.7847222222222222 | 0 |
| 0.7854166666666668 | 0 |
| 0.7861111111111111 | 0 |
| 0.7868055555555555 | 0 |
| 0.7875 | 0 |
| 0.7881944444444445 | 0 |
| 0.7888888888888889 | 0 |
| 0.7895833333333333 | 0 |
| 0.7902777777777777 | 0 |
| 0.7909722222222223 | 0 |
| 0.7916666666666666 | 0 |
| 0.7923611111111111 | 0 |
| 0.7930555555555556 | 0 |
| 0.7937500000000001 | 0 |
| 0.7944444444444444 | 0 |
| 0.7951388888888888 | 0 |
| 0.7958333333333334 | 0 |
| 0.7965277777777778 | 0 |
| 0.7972222222222222 | 0 |
| 0.7979166666666666 | 0 |
| 0.7986111111111112 | 0 |
| 0.7993055555555556 | 0 |
| 0.7999999999999999 | 0 |
| 0.8006944444444444 | 0 |
| 0.8013888888888889 | 0 |
| 0.8020833333333334 | 0 |
| 0.8027777777777777 | 0 |
| 0.8034722222222223 | 0 |
| 0.8041666666666667 | 0 |
| 0.8048611111111111 | 0 |
| 0.8055555555555555 | 0 |
| 0.80625 | 0 |
| 0.8069444444444445 | 0 |
| 0.8076388888888889 | 0 |
| 0.8083333333333332 | 0 |
| 0.8090277777777778 | 0 |
| 0.8097222222222222 | 0 |
| 0.8104166666666667 | 0 |
| 0.811111111111111 | 0 |
| 0.8118055555555556 | 0 |
| 0.8125 | 0 |
| 0.8131944444444444 | 0 |
| 0.813888888888889 | 0 |
| 0.8145833333333333 | 0 |
| 0.8152777777777778 | 0 |
| 0.8159722222222222 | 0 |
| 0.8166666666666668 | 0 |
| 0.8173611111111111 | 0 |
| 0.8180555555555555 | 0 |
| 0.81875 | 0 |
| 0.8194444444444445 | 0 |
| 0.8201388888888889 | 0 |
| 0.8208333333333333 | 0 |
| 0.8215277777777777 | 0 |
| 0.8222222222222223 | 0 |
| 0.8229166666666666 | 0 |
| 0.8236111111111111 | 0 |
| 0.8243055555555556 | 0 |
| 0.8250000000000001 | 0 |
| 0.8256944444444444 | 0 |
| 0.8263888888888888 | 0 |
| 0.8270833333333334 | 0 |
| 0.8277777777777778 | 0 |
| 0.8284722222222222 | 0 |
| 0.8291666666666666 | 0 |
| 0.8298611111111112 | 0 |
| 0.8305555555555556 | 0 |
| 0.8312499999999999 | 0 |
| 0.8319444444444444 | 0 |
| 0.8326388888888889 | 0 |
| 0.8333333333333334 | 0 |
| 0.8340277777777777 | 0 |
| 0.8347222222222223 | 0 |
| 0.8354166666666667 | 0 |
| 0.8361111111111111 | 0 |
| 0.8368055555555555 | 0 |
| 0.8375 | 0 |
| 0.8381944444444445 | 0 |
| 0.8388888888888889 | 0 |
| 0.8395833333333332 | 0 |
| 0.8402777777777778 | 0 |
| 0.8409722222222222 | 0 |
| 0.8416666666666667 | 0 |
| 0.842361111111111 | 0 |
| 0.8430555555555556 | 0 |
| 0.84375 | 0 |
| 0.8444444444444444 | 0 |
| 0.845138888888889 | 0 |
| 0.8458333333333333 | 0 |
| 0.8465277777777778 | 0 |
| 0.8472222222222222 | 0 |
| 0.8479166666666668 | 0 |
| 0.8486111111111111 | 0 |
| 0.8493055555555555 | 0 |
| 0.85 | 0 |
| 0.8506944444444445 | 0 |
| 0.8513888888888889 | 0 |
| 0.8520833333333333 | 0 |
| 0.8527777777777777 | 0 |
| 0.8534722222222223 | 0 |
| 0.8541666666666666 | 0 |
| 0.8548611111111111 | 0 |
| 0.8555555555555556 | 0 |
| 0.8562500000000001 | 0 |
| 0.8569444444444444 | 0 |
| 0.8576388888888888 | 0 |
| 0.8583333333333334 | 0 |
| 0.8590277777777778 | 0 |
| 0.8597222222222222 | 0 |
| 0.8604166666666666 | 0 |
| 0.8611111111111112 | 0 |
| 0.8618055555555556 | 0 |
| 0.8624999999999999 | 0 |
| 0.8631944444444444 | 0 |
| 0.8638888888888889 | 0 |
| 0.8645833333333334 | 0 |
| 0.8652777777777777 | 0 |
| 0.8659722222222223 | 0 |
| 0.8666666666666667 | 0 |
| 0.8673611111111111 | 0 |
| 0.8680555555555555 | 0 |
| 0.86875 | 0 |
| 0.8694444444444445 | 0 |
| 0.8701388888888889 | 0 |
| 0.8708333333333332 | 0 |
| 0.8715277777777778 | 0 |
| 0.8722222222222222 | 0 |
| 0.8729166666666667 | 0 |
| 0.873611111111111 | 0 |
| 0.8743055555555556 | 0 |
| 0.875 | 0 |
| 0.8756944444444444 | 0 |
| 0.876388888888889 | 0 |
| 0.8770833333333333 | 0 |
| 0.8777777777777778 | 0 |
| 0.8784722222222222 | 0 |
| 0.8791666666666668 | 0 |
| 0.8798611111111111 | 0 |
| 0.8805555555555555 | 0 |
| 0.88125 | 0 |
| 0.8819444444444445 | 0 |
| 0.8826388888888889 | 0 |
| 0.8833333333333333 | 0 |
| 0.8840277777777777 | 0 |
| 0.8847222222222223 | 0 |
| 0.8854166666666666 | 0 |
| 0.8861111111111111 | 0 |
| 0.8868055555555556 | 0 |
| 0.8875000000000001 | 0 |
| 0.8881944444444444 | 0 |
| 0.8888888888888888 | 0 |
| 0.8895833333333334 | 0 |
| 0.8902777777777778 | 0 |
| 0.8909722222222222 | 0 |
| 0.8916666666666666 | 0 |
| 0.8923611111111112 | 0 |
| 0.8930555555555556 | 0 |
| 0.8937499999999999 | 0 |
| 0.8944444444444444 | 0 |
| 0.8951388888888889 | 0 |
| 0.8958333333333334 | 0 |
| 0.8965277777777777 | 0 |
| 0.8972222222222223 | 0 |
| 0.8979166666666667 | 0 |
| 0.8986111111111111 | 0 |
| 0.8993055555555555 | 0 |
| 0.9 | 0 |
| 0.9006944444444445 | 0 |
| 0.9013888888888889 | 0 |
| 0.9020833333333332 | 0 |
| 0.9027777777777778 | 0 |
| 0.9034722222222222 | 0 |
| 0.9041666666666667 | 0 |
| 0.904861111111111 | 0 |
| 0.9055555555555556 | 0 |
| 0.90625 | 0 |
| 0.9069444444444444 | 0 |
| 0.907638888888889 | 0 |
| 0.9083333333333333 | 0 |
| 0.9090277777777778 | 0 |
| 0.9097222222222222 | 0 |
| 0.9104166666666668 | 0 |
| 0.9111111111111111 | 0 |
| 0.9118055555555555 | 0 |
| 0.9125 | 0 |
| 0.9131944444444445 | 0 |
| 0.9138888888888889 | 0 |
| 0.9145833333333333 | 0 |
| 0.9152777777777777 | 0 |
| 0.9159722222222223 | 0 |
| 0.9166666666666666 | 0 |
| 0.9173611111111111 | 0 |
| 0.9180555555555556 | 0 |
| 0.9187500000000001 | 0 |
| 0.9194444444444444 | 0 |
| 0.9201388888888888 | 0 |
| 0.9208333333333334 | 0 |
| 0.9215277777777778 | 0 |
| 0.9222222222222222 | 0 |
| 0.9229166666666666 | 0 |
| 0.9236111111111112 | 0 |
| 0.9243055555555556 | 0 |
| 0.9249999999999999 | 0 |
| 0.9256944444444444 | 0 |
| 0.9263888888888889 | 0 |
| 0.9270833333333334 | 0 |
| 0.9277777777777777 | 0 |
| 0.9284722222222223 | 0 |
| 0.9291666666666667 | 0 |
| 0.9298611111111111 | 0 |
| 0.9305555555555555 | 0 |
| 0.93125 | 0 |
| 0.9319444444444445 | 0 |
| 0.9326388888888889 | 0 |
| 0.9333333333333332 | 0 |
| 0.9340277777777778 | 0 |
| 0.9347222222222222 | 0 |
| 0.9354166666666667 | 0 |
| 0.936111111111111 | 0 |
| 0.9368055555555556 | 0 |
| 0.9375 | 0 |
| 0.9381944444444444 | 0 |
| 0.938888888888889 | 0 |
| 0.9395833333333333 | 0 |
| 0.9402777777777778 | 0 |
| 0.9409722222222222 | 0 |
| 0.9416666666666668 | 0 |
| 0.9423611111111111 | 0 |
| 0.9430555555555555 | 0 |
| 0.94375 | 0 |
| 0.9444444444444445 | 0 |
| 0.9451388888888889 | 0 |
| 0.9458333333333333 | 0 |
| 0.9465277777777777 | 0 |
| 0.9472222222222223 | 0 |
| 0.9479166666666666 | 0 |
| 0.9486111111111111 | 0 |
| 0.9493055555555556 | 0 |
| 0.9500000000000001 | 0 |
| 0.9506944444444444 | 0 |
| 0.9513888888888888 | 0 |
| 0.9520833333333334 | 0 |
| 0.9527777777777778 | 0 |
| 0.9534722222222222 | 0 |
| 0.9541666666666666 | 0 |
| 0.9548611111111112 | 0 |
| 0.9555555555555556 | 0 |
| 0.9562499999999999 | 0 |
| 0.9569444444444444 | 0 |
| 0.9576388888888889 | 0 |
| 0.9583333333333334 | 0 |
| 0.9590277777777777 | 0 |
| 0.9597222222222223 | 0 |
| 0.9604166666666667 | 0 |
| 0.9611111111111111 | 0 |
| 0.9618055555555555 | 0 |
| 0.9625 | 0 |
| 0.9631944444444445 | 0 |
| 0.9638888888888889 | 0 |
| 0.9645833333333332 | 0 |
| 0.9652777777777778 | 0 |
| 0.9659722222222222 | 0 |
| 0.9666666666666667 | 0 |
| 0.967361111111111 | 0 |
| 0.9680555555555556 | 0 |
| 0.96875 | 0 |
| 0.9694444444444444 | 0 |
| 0.970138888888889 | 0 |
| 0.9708333333333333 | 0 |
| 0.9715277777777778 | 0 |
| 0.9722222222222222 | 0 |
| 0.9729166666666668 | 0 |
| 0.9736111111111111 | 0 |
| 0.9743055555555555 | 0 |
| 0.975 | 0 |
| 0.9756944444444445 | 0 |
| 0.9763888888888889 | 0 |
| 0.9770833333333333 | 0 |
| 0.9777777777777777 | 0 |
| 0.9784722222222223 | 0 |
| 0.9791666666666666 | 0 |
| 0.9798611111111111 | 0 |
| 0.9805555555555556 | 0 |
| 0.9812500000000001 | 0 |
| 0.9819444444444444 | 0 |
| 0.9826388888888888 | 0 |
| 0.9833333333333334 | 0 |
| 0.9840277777777778 | 0 |
| 0.9847222222222222 | 0 |
| 0.9854166666666666 | 0 |
| 0.9861111111111112 | 0 |
| 0.9868055555555556 | 0 |
| 0.9874999999999999 | 0 |
| 0.9881944444444444 | 0 |
| 0.9888888888888889 | 0 |
| 0.9895833333333334 | 0 |
| 0.9902777777777777 | 0 |
| 0.9909722222222223 | 0 |
| 0.9916666666666667 | 0 |
| 0.9923611111111111 | 0 |
| 0.9930555555555555 | 0 |
| 0.99375 | 0 |
| 0.9944444444444445 | 0 |
| 0.9951388888888889 | 0 |
| 0.9958333333333332 | 0 |
| 0.9965277777777778 | 0 |
| 0.9972222222222222 | 0 |
| 0.9979166666666667 | 0 |
| 0.998611111111111 | 0 |
| 0.9993055555555556 | 0 |